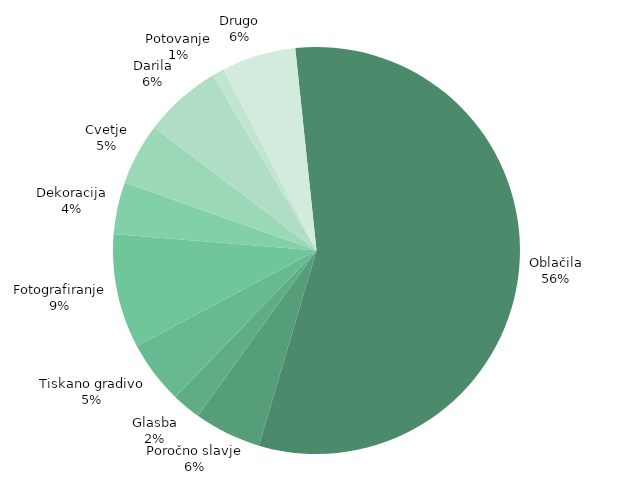
| Category | DEJANSKI |
|---|---|
| Oblačila | 9770 |
| Poročno slavje | 928 |
| Glasba | 400 |
| Tiskano gradivo | 870 |
| Fotografiranje | 1575 |
| Dekoracija | 720 |
| Cvetje | 850 |
| Darila | 1075 |
| Potovanje | 165 |
| Drugo | 1021 |